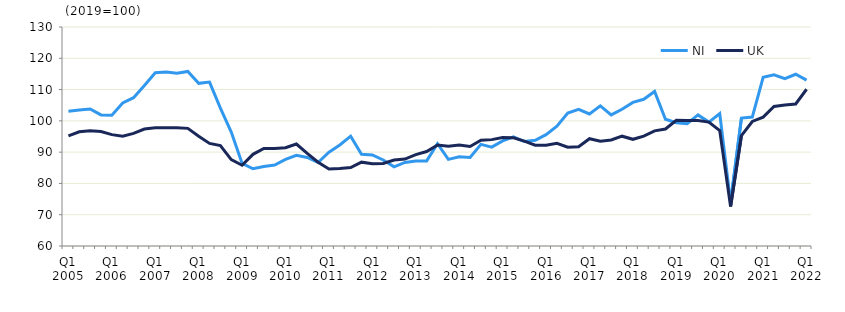
| Category | NI | UK  |
|---|---|---|
| Q1 2005 | 103.1 | 95.2 |
|  | 103.5 | 96.5 |
| Q3 2005 | 103.8 | 96.8 |
|  | 101.9 | 96.6 |
| Q1 2006 | 101.8 | 95.6 |
|  | 105.7 | 95.1 |
| Q3 2006 | 107.4 | 96 |
|  | 111.3 | 97.4 |
| Q1 2007 | 115.4 | 97.8 |
|  | 115.6 | 97.8 |
| Q3 2007 | 115.2 | 97.8 |
|  | 115.8 | 97.6 |
| Q1 2008 | 112 | 95.1 |
|  | 112.4 | 92.8 |
| Q3 2008 | 104.1 | 92.1 |
|  | 96.4 | 87.6 |
| Q1 2009 | 86.4 | 85.8 |
|  | 84.7 | 89.3 |
| Q3 2009 | 85.4 | 91.2 |
|  | 85.9 | 91.2 |
| Q1 2010 | 87.7 | 91.4 |
|  | 89 | 92.6 |
| Q3 2010 | 88.3 | 89.6 |
|  | 86.7 | 86.8 |
| Q1 2011 | 90 | 84.6 |
|  | 92.3 | 84.8 |
| Q3 2011 | 95.1 | 85.1 |
|  | 89.3 | 86.8 |
| Q1 2012 | 89.1 | 86.3 |
|  | 87.5 | 86.4 |
| Q3 2012 | 85.3 | 87.5 |
|  | 86.7 | 87.8 |
| Q1 2013 | 87.2 | 89.2 |
|  | 87.2 | 90.2 |
| Q3 2013 | 92.7 | 92.3 |
|  | 87.7 | 91.9 |
| Q1 2014 | 88.5 | 92.3 |
|  | 88.3 | 91.8 |
| Q3 2014 | 92.5 | 93.8 |
|  | 91.6 | 94 |
| Q1 2015 | 93.6 | 94.7 |
|  | 94.9 | 94.6 |
| Q3 2015 | 93.4 | 93.5 |
|  | 93.8 | 92.2 |
| Q1 2016 | 95.6 | 92.2 |
|  | 98.3 | 92.8 |
| Q3 2016 | 102.5 | 91.6 |
|  | 103.7 | 91.7 |
| Q1 2017 | 102.2 | 94.3 |
|  | 104.8 | 93.5 |
| Q3 2017 | 101.9 | 93.9 |
|  | 103.7 | 95.1 |
| Q1 2018 | 105.9 | 94.1 |
|  | 106.9 | 95.1 |
| Q3 2018 | 109.4 | 96.8 |
|  | 100.5 | 97.4 |
| Q1 2019 | 99.4 | 100.2 |
|  | 99.1 | 100.1 |
| Q3 2019 | 101.9 | 100.1 |
|  | 99.6 | 99.6 |
| Q1 2020 | 102.3 | 96.9 |
|  | 73.9 | 72.6 |
| Q3 2020 | 100.9 | 95.3 |
|  | 101.2 | 99.8 |
| Q1 2021 | 113.9 | 101.2 |
|  | 114.7 | 104.6 |
| Q3 2021 | 113.5 | 105.1 |
|  | 114.9 | 105.4 |
| Q1 2022 | 113 | 110.1 |